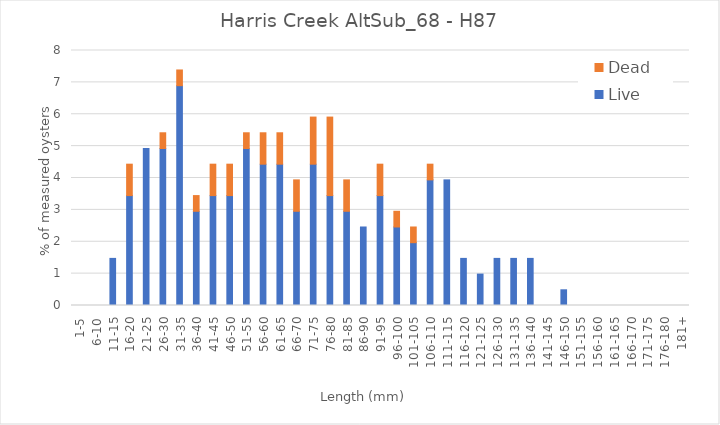
| Category | Live | Dead |
|---|---|---|
| 1-5 | 0 | 0 |
| 6-10 | 0 | 0 |
| 11-15 | 1.478 | 0 |
| 16-20 | 3.448 | 0.985 |
| 21-25 | 4.926 | 0 |
| 26-30 | 4.926 | 0.493 |
| 31-35 | 6.897 | 0.493 |
| 36-40 | 2.956 | 0.493 |
| 41-45 | 3.448 | 0.985 |
| 46-50 | 3.448 | 0.985 |
| 51-55 | 4.926 | 0.493 |
| 56-60 | 4.433 | 0.985 |
| 61-65 | 4.433 | 0.985 |
| 66-70 | 2.956 | 0.985 |
| 71-75 | 4.433 | 1.478 |
| 76-80 | 3.448 | 2.463 |
| 81-85 | 2.956 | 0.985 |
| 86-90 | 2.463 | 0 |
| 91-95 | 3.448 | 0.985 |
| 96-100 | 2.463 | 0.493 |
| 101-105 | 1.97 | 0.493 |
| 106-110 | 3.941 | 0.493 |
| 111-115 | 3.941 | 0 |
| 116-120 | 1.478 | 0 |
| 121-125 | 0.985 | 0 |
| 126-130 | 1.478 | 0 |
| 131-135 | 1.478 | 0 |
| 136-140 | 1.478 | 0 |
| 141-145 | 0 | 0 |
| 146-150 | 0.493 | 0 |
| 151-155 | 0 | 0 |
| 156-160 | 0 | 0 |
| 161-165 | 0 | 0 |
| 166-170 | 0 | 0 |
| 171-175 | 0 | 0 |
| 176-180 | 0 | 0 |
| 181+ | 0 | 0 |